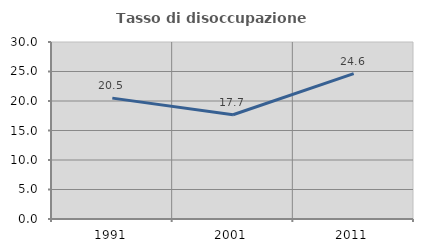
| Category | Tasso di disoccupazione giovanile  |
|---|---|
| 1991.0 | 20.488 |
| 2001.0 | 17.672 |
| 2011.0 | 24.638 |